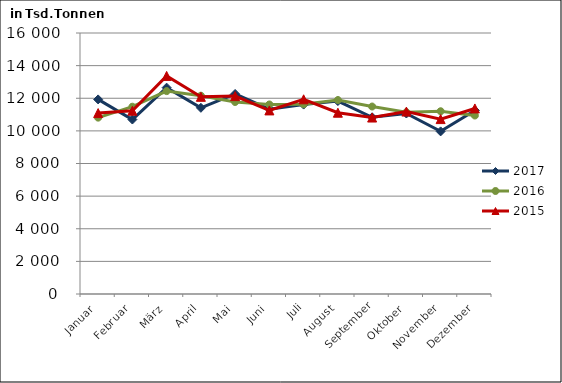
| Category | 2017 | 2016 | 2015 |
|---|---|---|---|
| Januar | 11929.047 | 10811.685 | 11089.371 |
| Februar | 10695.69 | 11480.631 | 11233.202 |
| März | 12650.97 | 12438.691 | 13370.037 |
| April | 11413.511 | 12157.936 | 12088.081 |
| Mai | 12262.781 | 11770.352 | 12130.812 |
| Juni | 11331.271 | 11618.936 | 11254.555 |
| Juli | 11611.336 | 11632.772 | 11934.829 |
| August | 11824.714 | 11889.738 | 11113.407 |
| September | 10834.028 | 11492.729 | 10817.107 |
| Oktober | 11064.287 | 11146.784 | 11183.561 |
| November | 9968.597 | 11203.61 | 10721.61 |
| Dezember | 11252.284 | 10941.578 | 11374.913 |